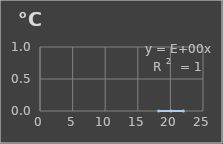
| Category | Temperatura |
|---|---|
| 18.2 | 0 |
| 20.1 | 0 |
| 22.0 | 0 |